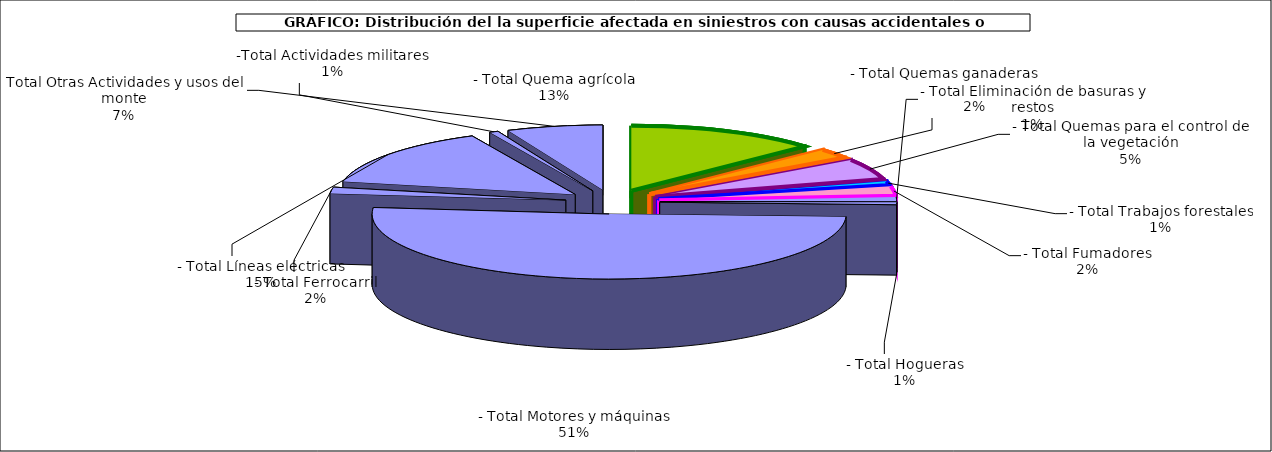
| Category | Series 0 |
|---|---|
| - Total Quema agrícola | 2896.02 |
| - Total Quemas ganaderas                 | 530.47 |
| - Total Quemas para el control de la vegetación | 1148.72 |
| - Total Trabajos forestales | 207.2 |
| - Total Fumadores | 521.87 |
| - Total Eliminación de basuras y restos | 254.58 |
| - Total Hogueras | 129.37 |
| - Total Motores y máquinas | 11316.15 |
| - Total Ferrocarril | 349.94 |
| - Total Líneas eléctricas | 3250.25 |
| -Total Actividades militares | 134.91 |
|  Total Otras Actividades y usos del monte | 1454.34 |